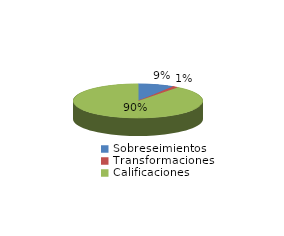
| Category | Series 0 |
|---|---|
| Sobreseimientos | 31 |
| Transformaciones | 5 |
| Calificaciones | 310 |